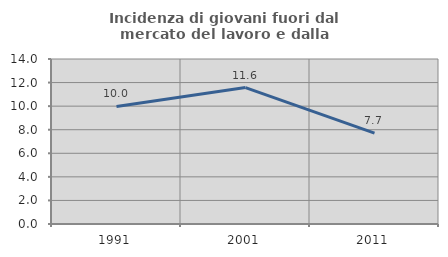
| Category | Incidenza di giovani fuori dal mercato del lavoro e dalla formazione  |
|---|---|
| 1991.0 | 9.977 |
| 2001.0 | 11.576 |
| 2011.0 | 7.717 |